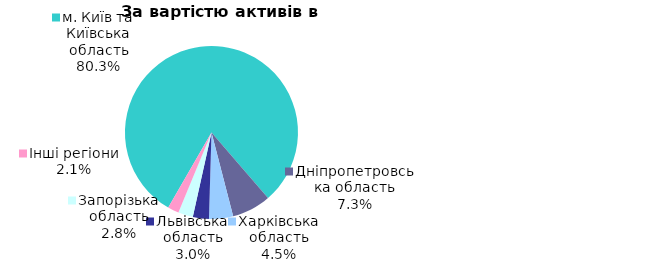
| Category | Series 0 |
|---|---|
| м. Київ та Київська область | 0.803 |
| Дніпропетровська область | 0.073 |
| Харківська область | 0.045 |
| Львівська область | 0.03 |
| Запорізька область | 0.028 |
| Інші регіони | 0.021 |